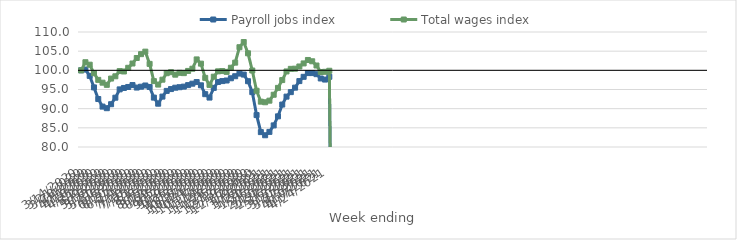
| Category | Payroll jobs index | Total wages index |
|---|---|---|
| 14/03/2020 | 100 | 100 |
| 21/03/2020 | 100.207 | 102.114 |
| 28/03/2020 | 98.556 | 101.473 |
| 04/04/2020 | 95.547 | 99.246 |
| 11/04/2020 | 92.517 | 97.512 |
| 18/04/2020 | 90.54 | 96.778 |
| 25/04/2020 | 90.121 | 96.213 |
| 02/05/2020 | 91.161 | 97.851 |
| 09/05/2020 | 92.862 | 98.445 |
| 16/05/2020 | 95.03 | 99.798 |
| 23/05/2020 | 95.402 | 99.702 |
| 30/05/2020 | 95.658 | 100.664 |
| 06/06/2020 | 96.157 | 101.78 |
| 13/06/2020 | 95.507 | 103.215 |
| 20/06/2020 | 95.729 | 104.222 |
| 27/06/2020 | 96.044 | 104.876 |
| 04/07/2020 | 95.658 | 101.684 |
| 11/07/2020 | 92.884 | 97.186 |
| 18/07/2020 | 91.295 | 96.284 |
| 25/07/2020 | 93.147 | 97.561 |
| 01/08/2020 | 94.634 | 99.25 |
| 08/08/2020 | 95.111 | 99.515 |
| 15/08/2020 | 95.467 | 98.868 |
| 22/08/2020 | 95.596 | 99.353 |
| 29/08/2020 | 95.752 | 99.272 |
| 05/09/2020 | 96.145 | 99.844 |
| 12/09/2020 | 96.519 | 100.418 |
| 19/09/2020 | 96.942 | 102.849 |
| 26/09/2020 | 96.096 | 101.745 |
| 03/10/2020 | 93.78 | 98.035 |
| 10/10/2020 | 92.896 | 96.206 |
| 17/10/2020 | 95.421 | 98.346 |
| 24/10/2020 | 96.968 | 99.737 |
| 31/10/2020 | 97.194 | 99.807 |
| 07/11/2020 | 97.347 | 99.6 |
| 14/11/2020 | 97.931 | 100.674 |
| 21/11/2020 | 98.464 | 102.007 |
| 28/11/2020 | 99.158 | 106.031 |
| 05/12/2020 | 98.894 | 107.377 |
| 12/12/2020 | 97.165 | 104.44 |
| 19/12/2020 | 94.311 | 99.954 |
| 26/12/2020 | 88.327 | 94.676 |
| 02/01/2021 | 83.881 | 91.825 |
| 09/01/2021 | 83.063 | 91.672 |
| 16/01/2021 | 83.945 | 92.087 |
| 23/01/2021 | 85.636 | 93.633 |
| 30/01/2021 | 87.997 | 95.426 |
| 06/02/2021 | 91.074 | 97.459 |
| 13/02/2021 | 93.144 | 99.712 |
| 20/02/2021 | 94.313 | 100.385 |
| 27/02/2021 | 95.484 | 100.43 |
| 06/03/2021 | 97.193 | 101.004 |
| 13/03/2021 | 98.308 | 101.801 |
| 20/03/2021 | 99.284 | 102.702 |
| 27/03/2021 | 99.28 | 102.365 |
| 03/04/2021 | 99.003 | 101.258 |
| 10/04/2021 | 97.877 | 99.563 |
| 17/04/2021 | 97.591 | 99.615 |
| 24/04/2021 | 98.314 | 99.888 |